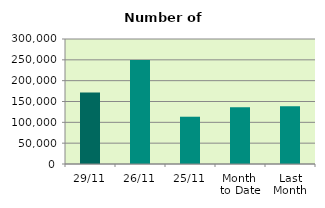
| Category | Series 0 |
|---|---|
| 29/11 | 171692 |
| 26/11 | 249696 |
| 25/11 | 113452 |
| Month 
to Date | 136180.476 |
| Last
Month | 138693.238 |